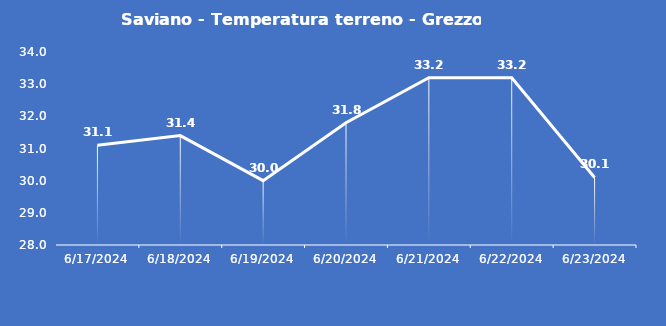
| Category | Saviano - Temperatura terreno - Grezzo (°C) |
|---|---|
| 6/17/24 | 31.1 |
| 6/18/24 | 31.4 |
| 6/19/24 | 30 |
| 6/20/24 | 31.8 |
| 6/21/24 | 33.2 |
| 6/22/24 | 33.2 |
| 6/23/24 | 30.1 |